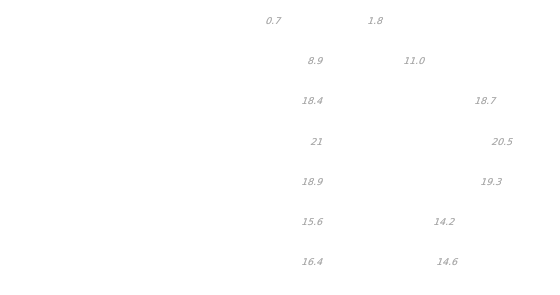
| Category | Hommes | Femmes |
|---|---|---|
| 0 à 14 ans | -16.4 | 14.6 |
| 15 à 29 ans | -15.6 | 14.2 |
| 30 à 44 ans | -18.9 | 19.3 |
| 45 à 59 ans | -21 | 20.5 |
| 60 à 74 ans | -18.4 | 18.7 |
| 75 à 89 ans | -8.9 | 11 |
| 90 ans ou plus | -0.7 | 1.8 |